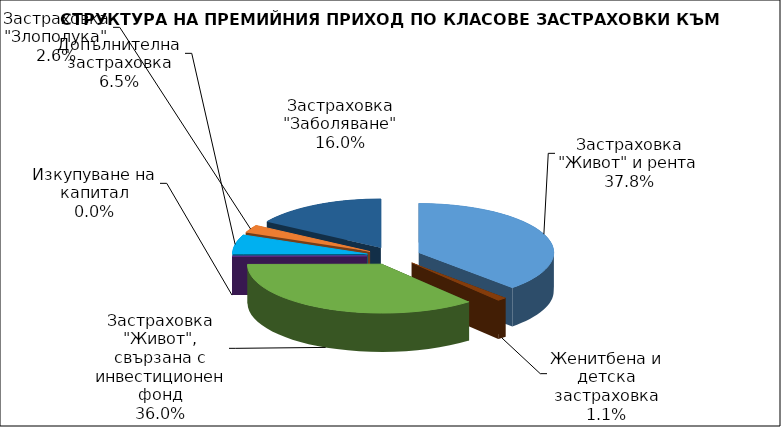
| Category | Застраховка "Живот" и рента |
|---|---|
| Застраховка "Живот" и рента | 76520558.212 |
| Женитбена и детска застраховка | 2279906.078 |
| Застраховка "Живот", свързана с инвестиционен фонд | 72869318.132 |
| Изкупуване на капитал | 0 |
| Допълнителна застраховка | 13108572.822 |
| Застраховка "Злополука" | 5274929.19 |
| Застраховка "Заболяване" | 32403324.01 |